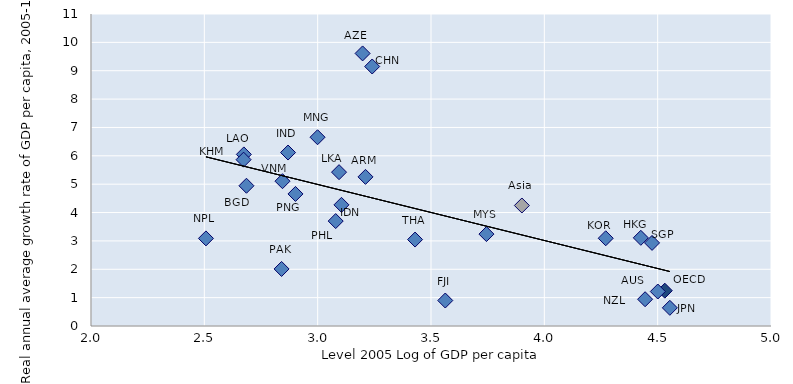
| Category | 2005-2015 |
|---|---|
| 4.531425925705401 | 1.245 |
| 4.475229883142025 | 2.93 |
| 4.444569404417406 | 0.944 |
| 4.425691291165069 | 3.109 |
| 4.500640537478336 | 1.216 |
| 4.55365453799429 | 0.641 |
| 4.27085395914169 | 3.093 |
| 3.9009738732017527 | 4.249 |
| 3.7446052949666413 | 3.24 |
| 3.198208083132139 | 9.61 |
| 3.2405725064848063 | 9.149 |
| 3.429744389498829 | 3.048 |
| 3.56297481349345 | 0.898 |
| 2.999478775344154 | 6.655 |
| 3.210962331263276 | 5.257 |
| 3.0942713826642816 | 5.424 |
| 3.104987087138769 | 4.271 |
| 3.0795443685203248 | 3.699 |
| 2.9021275430444935 | 4.656 |
| 2.8447875816021693 | 5.105 |
| 2.674319027904613 | 6.05 |
| 2.8692987723157906 | 6.116 |
| 2.840843949711977 | 2.011 |
| 2.6858817300767317 | 4.944 |
| 2.6731707202009463 | 5.864 |
| 2.507120210480175 | 3.088 |